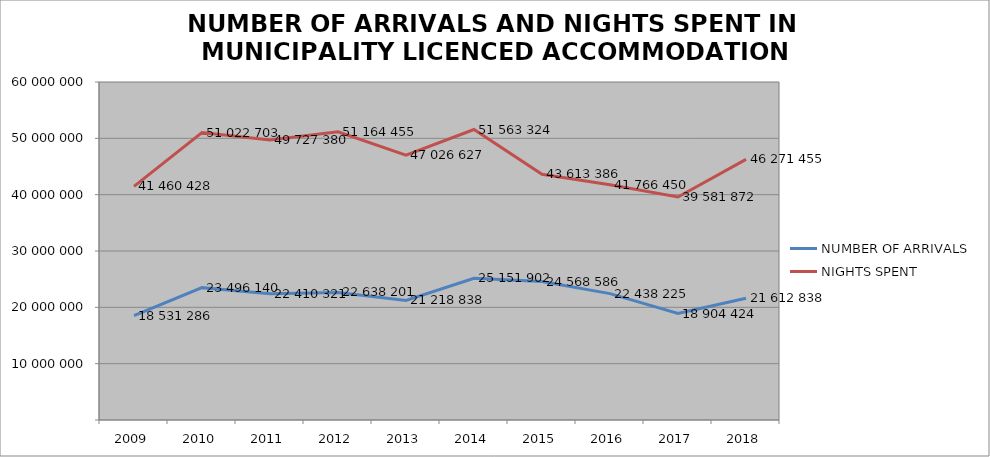
| Category | NUMBER OF ARRIVALS | NIGHTS SPENT |
|---|---|---|
| 2009 | 18531286 | 41460428 |
| 2010 | 23496140 | 51022703 |
| 2011 | 22410321 | 49727380 |
| 2012 | 22638201 | 51164455 |
| 2013 | 21218838 | 47026627 |
| 2014 | 25151902 | 51563324 |
| 2015 | 24568586 | 43613386 |
| 2016 | 22438225 | 41766450 |
| 2017 | 18904424 | 39581872 |
| 2018 | 21612838 | 46271455 |